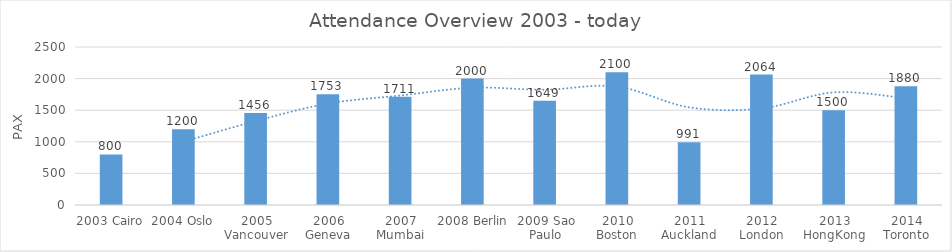
| Category | Attendance |
|---|---|
| 2003 Cairo | 800 |
| 2004 Oslo | 1200 |
| 2005 Vancouver | 1456 |
| 2006 Geneva | 1753 |
| 2007 Mumbai | 1711 |
| 2008 Berlin | 2000 |
| 2009 Sao Paulo | 1649 |
| 2010 Boston | 2100 |
| 2011 Auckland | 991 |
| 2012 London | 2064 |
| 2013 HongKong | 1500 |
| 2014 Toronto | 1880 |